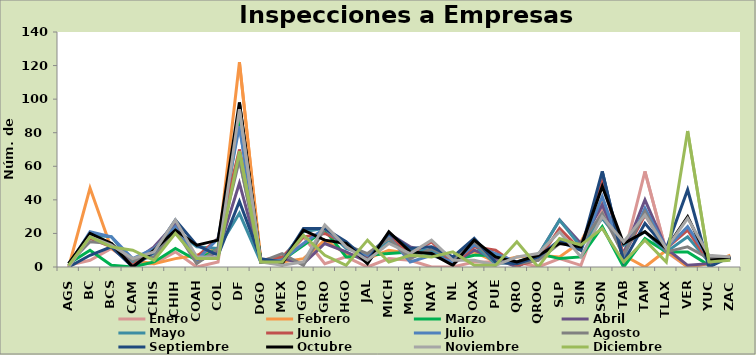
| Category | Enero | Febrero | Marzo | Abril | Mayo | Junio | Julio | Agosto | Septiembre | Octubre | Noviembre | Diciembre |
|---|---|---|---|---|---|---|---|---|---|---|---|---|
| AGS | 1 | 0 | 2 | 0 | 2 | 1 | 1 | 2 | 0 | 2 | 0 | 1 |
| BC | 4 | 47 | 10 | 19 | 19 | 17 | 21 | 15 | 7 | 20 | 18 | 18 |
| BCS | 11 | 11 | 1 | 14 | 18 | 12 | 18 | 14 | 12 | 14 | 13 | 12 |
| CAM | 2 | 4 | 0 | 3 | 3 | 1 | 5 | 4 | 0 | 0 | 5 | 10 |
| CHIS | 2 | 2 | 3 | 12 | 8 | 11 | 11 | 6 | 9 | 10 | 9 | 4 |
| CHIH | 9 | 5 | 11 | 26 | 22 | 24 | 24 | 22 | 28 | 22 | 28 | 20 |
| COAH | 0 | 7 | 4 | 3 | 12 | 6 | 4 | 2 | 13 | 13 | 6 | 5 |
| COL | 3 | 11 | 11 | 9 | 11 | 17 | 17 | 11 | 7 | 16 | 6 | 5 |
| DF | 92 | 122 | 88 | 50 | 32 | 70 | 84 | 64 | 39 | 98 | 94 | 69 |
| DGO | 5 | 4 | 4 | 3 | 3 | 4 | 3 | 3 | 5 | 3 | 3 | 3 |
| MEX | 1 | 3 | 4 | 5 | 5 | 6 | 4 | 8 | 3 | 2 | 1 | 3 |
| GTO | 18 | 5 | 13 | 2 | 21 | 18 | 14 | 1 | 23 | 22 | 3 | 19 |
| GRO | 2 | 16 | 22 | 14 | 23 | 20 | 23 | 23 | 23 | 16 | 25 | 7 |
| HGO | 6 | 8 | 6 | 9 | 11 | 14 | 12 | 13 | 15 | 14 | 12 | 1 |
| JAL | 0 | 5 | 7 | 3 | 7 | 5 | 7 | 8 | 4 | 2 | 4 | 16 |
| MICH | 5 | 10 | 8 | 20 | 15 | 19 | 18 | 17 | 20 | 21 | 14 | 3 |
| MOR | 4 | 8 | 9 | 12 | 10 | 8 | 3 | 5 | 11 | 9 | 8 | 7 |
| NAY | 0 | 9 | 8 | 9 | 10 | 15 | 7 | 11 | 12 | 8 | 16 | 6 |
| NL | 0 | 5 | 4 | 2 | 4 | 2 | 3 | 5 | 6 | 1 | 4 | 9 |
| OAX | 3 | 9 | 7 | 10 | 13 | 12 | 13 | 15 | 17 | 16 | 4 | 1 |
| PUE | 3 | 3 | 7 | 5 | 2 | 10 | 8 | 3 | 3 | 6 | 1 | 1 |
| QRO | 3 | 6 | 0 | 0 | 3 | 1 | 3 | 2 | 2 | 3 | 6 | 15 |
| QROO | 0 | 7 | 8 | 7 | 7 | 4 | 6 | 4 | 6 | 7 | 8 | 0 |
| SLP | 5 | 6 | 5 | 28 | 28 | 23 | 15 | 14 | 16 | 14 | 21 | 17 |
| SIN | 1 | 15 | 6 | 14 | 12 | 10 | 10 | 14 | 10 | 12 | 6 | 13 |
| SON | 35 | 40 | 24 | 37 | 29 | 51 | 42 | 32 | 57 | 48 | 30 | 23 |
| TAB | 6 | 7 | 0 | 8 | 13 | 7 | 6 | 7 | 3 | 14 | 15 | 3 |
| TAM | 57 | 0 | 17 | 40 | 21 | 31 | 35 | 33 | 26 | 21 | 31 | 16 |
| TLAX | 9 | 10 | 9 | 11 | 9 | 11 | 11 | 9 | 11 | 11 | 11 | 3 |
| VER | 0 | 0 | 9 | 1 | 18 | 22 | 24 | 12 | 46 | 30 | 29 | 81 |
| YUC | 2 | 2 | 1 | 2 | 3 | 3 | 5 | 5 | 0 | 4 | 7 | 3 |
| ZAC | 5 | 7 | 6 | 6 | 6 | 6 | 5 | 5 | 6 | 5 | 6 | 4 |